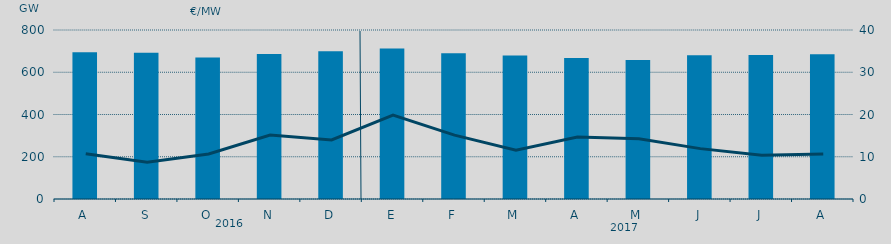
| Category | Energia (MWh) a subir |
|---|---|
| A | 694.56 |
| S | 691.889 |
| O | 669.591 |
| N | 686.044 |
| D | 698.836 |
| E | 712.52 |
| F | 690.067 |
| M | 679.79 |
| A | 667.793 |
| M | 657.634 |
| J | 680.754 |
| J | 681.722 |
| A | 685.083 |